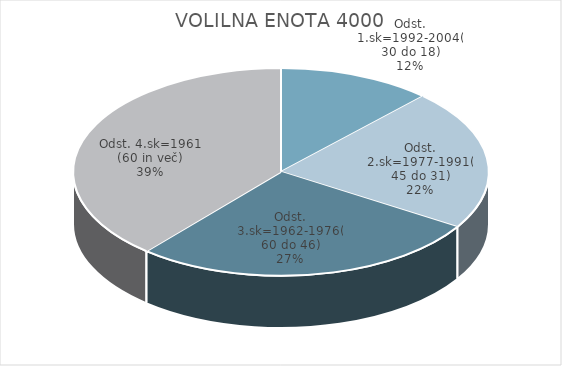
| Category | VOLILNA ENOTA 4000 |
|---|---|
| Odst. 1.sk=1992-2004(30 do 18) | 6.53 |
| Odst. 2.sk=1977-1991(45 do 31) | 11.95 |
| Odst. 3.sk=1962-1976(60 do 46) | 14.86 |
| Odst. 4.sk=1961 (60 in več) | 21.15 |